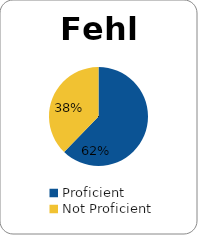
| Category | Series 0 |
|---|---|
| Proficient | 0.622 |
| Not Proficient | 0.378 |